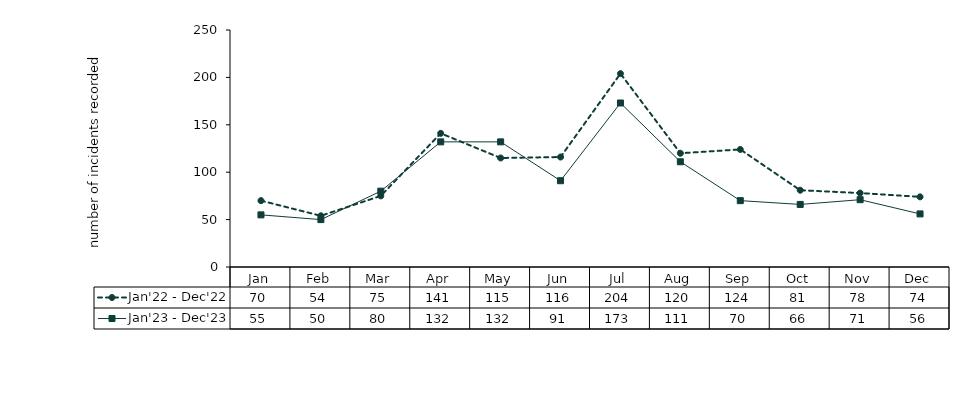
| Category | Jan'22 - Dec'22 | Jan'23 - Dec'23 |
|---|---|---|
| Jan | 70 | 55 |
| Feb | 54 | 50 |
| Mar | 75 | 80 |
| Apr | 141 | 132 |
| May | 115 | 132 |
| Jun | 116 | 91 |
| Jul | 204 | 173 |
| Aug | 120 | 111 |
| Sep | 124 | 70 |
| Oct | 81 | 66 |
| Nov | 78 | 71 |
| Dec | 74 | 56 |